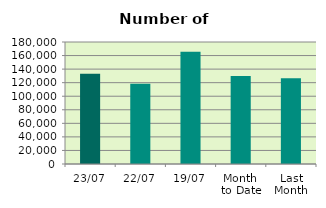
| Category | Series 0 |
|---|---|
| 23/07 | 133074 |
| 22/07 | 118310 |
| 19/07 | 165630 |
| Month 
to Date | 129997.176 |
| Last
Month | 126531 |